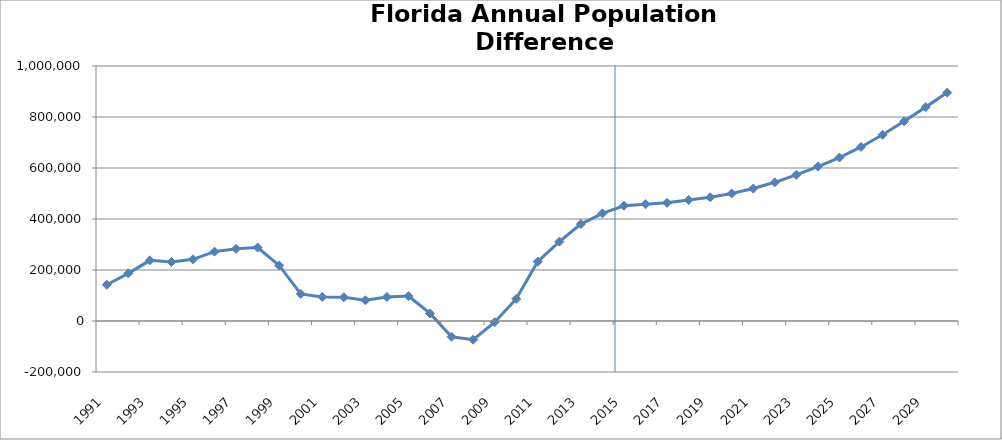
| Category | Difference |
|---|---|
| 1991-01-01 | 142156.583 |
| 1992-01-01 | 186893.034 |
| 1993-01-01 | 237820.428 |
| 1994-01-01 | 231625.794 |
| 1995-01-01 | 241869.059 |
| 1996-01-01 | 272085.854 |
| 1997-01-01 | 282984.254 |
| 1998-01-01 | 288135.221 |
| 1999-01-01 | 217798.765 |
| 2000-01-01 | 106154.056 |
| 2001-01-01 | 94346.867 |
| 2002-01-01 | 92869.504 |
| 2003-01-01 | 81140.536 |
| 2004-01-01 | 94006.749 |
| 2005-01-01 | 97577.378 |
| 2006-01-01 | 29606.858 |
| 2007-01-01 | -61707.104 |
| 2008-01-01 | -73143.909 |
| 2009-01-01 | -4639.755 |
| 2010-01-01 | 86928.75 |
| 2011-01-01 | 233055.527 |
| 2012-01-01 | 311067.633 |
| 2013-01-01 | 380077.056 |
| 2014-01-01 | 422023.636 |
| 2015-01-01 | 451987.203 |
| 2016-01-01 | 458030.018 |
| 2017-01-01 | 463299.421 |
| 2018-01-01 | 474609.279 |
| 2019-01-01 | 485278.767 |
| 2020-01-01 | 500297.591 |
| 2021-01-01 | 519384.613 |
| 2022-01-01 | 543907.316 |
| 2023-01-01 | 573042.969 |
| 2024-01-01 | 605773.499 |
| 2025-01-01 | 641034.572 |
| 2026-01-01 | 682519.906 |
| 2027-01-01 | 730179.843 |
| 2028-01-01 | 783077.921 |
| 2029-01-01 | 838727.934 |
| 2030-01-01 | 895699.37 |